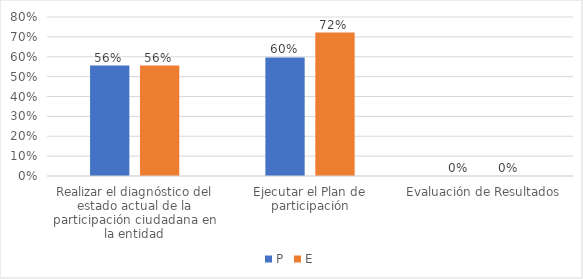
| Category | P | E |
|---|---|---|
| Realizar el diagnóstico del estado actual de la participación ciudadana en la entidad | 0.556 | 0.556 |
| Ejecutar el Plan de participación | 0.597 | 0.722 |
| Evaluación de Resultados | 0 | 0 |